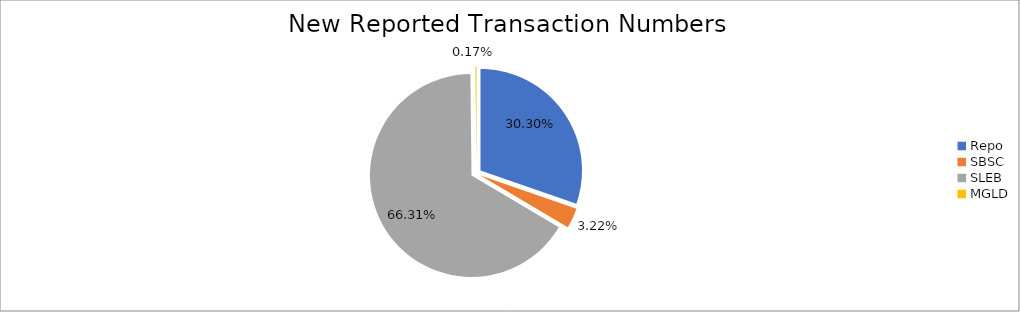
| Category | Series 0 |
|---|---|
| Repo | 391114 |
| SBSC | 41512 |
| SLEB | 856017 |
| MGLD | 2225 |